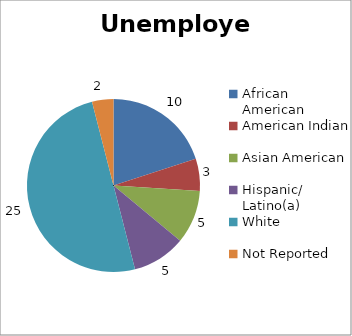
| Category | Unemployed |
|---|---|
| African American | 10 |
| American Indian | 3 |
| Asian American | 5 |
| Hispanic/ Latino(a) | 5 |
| White | 25 |
| Not Reported | 2 |